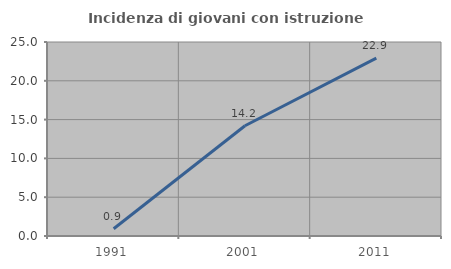
| Category | Incidenza di giovani con istruzione universitaria |
|---|---|
| 1991.0 | 0.939 |
| 2001.0 | 14.211 |
| 2011.0 | 22.93 |